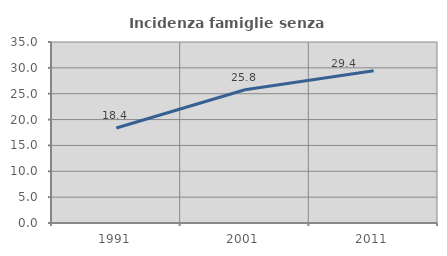
| Category | Incidenza famiglie senza nuclei |
|---|---|
| 1991.0 | 18.365 |
| 2001.0 | 25.758 |
| 2011.0 | 29.426 |